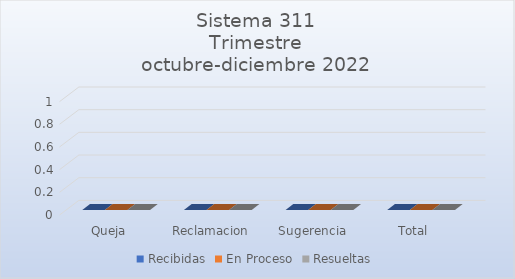
| Category | Recibidas | En Proceso | Resueltas |
|---|---|---|---|
| Queja | 0 | 0 | 0 |
| Reclamacion | 0 | 0 | 0 |
| Sugerencia | 0 | 0 | 0 |
| Total | 0 | 0 | 0 |